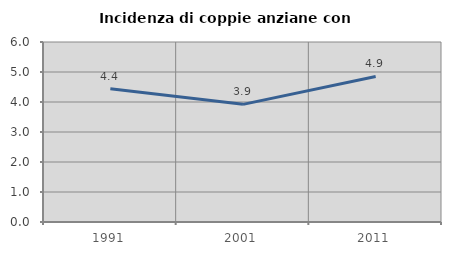
| Category | Incidenza di coppie anziane con figli |
|---|---|
| 1991.0 | 4.444 |
| 2001.0 | 3.922 |
| 2011.0 | 4.851 |